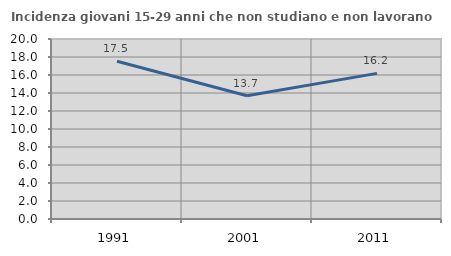
| Category | Incidenza giovani 15-29 anni che non studiano e non lavorano  |
|---|---|
| 1991.0 | 17.53 |
| 2001.0 | 13.69 |
| 2011.0 | 16.183 |